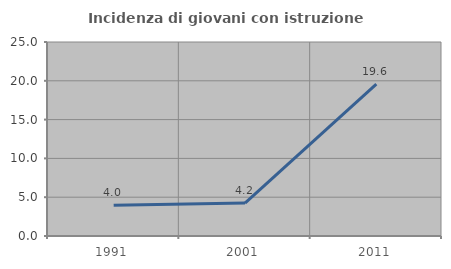
| Category | Incidenza di giovani con istruzione universitaria |
|---|---|
| 1991.0 | 3.977 |
| 2001.0 | 4.245 |
| 2011.0 | 19.565 |